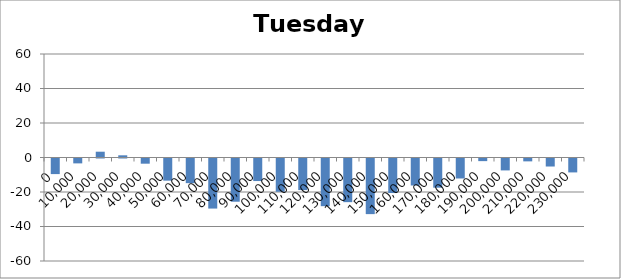
| Category | Tuesday 60 |
|---|---|
| 0.0 | -9.04 |
| 10000.0 | -2.83 |
| 20000.0 | 3.36 |
| 30000.0 | 1.27 |
| 40000.0 | -3.01 |
| 50000.0 | -12.835 |
| 60000.0 | -14.29 |
| 70000.0 | -29.025 |
| 80000.0 | -25.055 |
| 90000.0 | -13.075 |
| 100000.0 | -19.28 |
| 110000.0 | -18.305 |
| 120000.0 | -27.64 |
| 130000.0 | -25.305 |
| 140000.0 | -32.245 |
| 150000.0 | -20.025 |
| 160000.0 | -15.645 |
| 170000.0 | -16.92 |
| 180000.0 | -11.58 |
| 190000.0 | -1.525 |
| 200000.0 | -6.91 |
| 210000.0 | -1.66 |
| 220000.0 | -4.647 |
| 230000.0 | -8.065 |